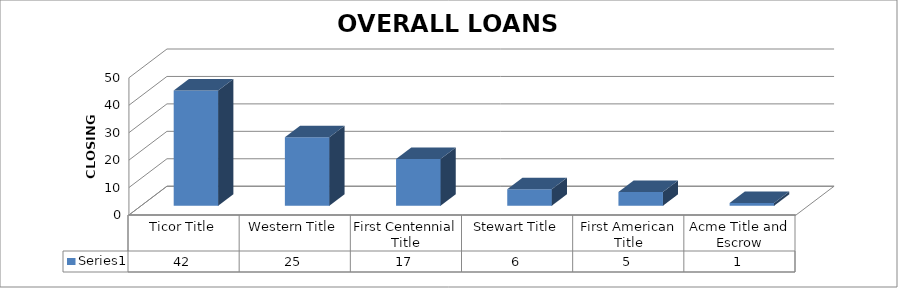
| Category | Series 0 |
|---|---|
| Ticor Title | 42 |
| Western Title | 25 |
| First Centennial Title | 17 |
| Stewart Title | 6 |
| First American Title | 5 |
| Acme Title and Escrow | 1 |